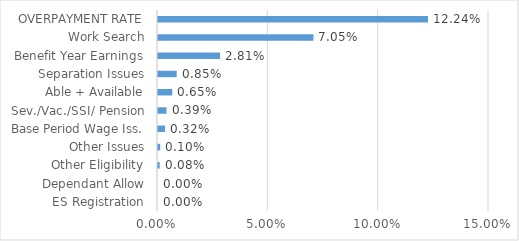
| Category | Series 0 |
|---|---|
| ES Registration | 0 |
| Dependant Allow | 0 |
| Other Eligibility | 0.001 |
| Other Issues | 0.001 |
| Base Period Wage Iss. | 0.003 |
| Sev./Vac./SSI/ Pension | 0.004 |
| Able + Available | 0.006 |
| Separation Issues | 0.008 |
| Benefit Year Earnings | 0.028 |
| Work Search | 0.07 |
| OVERPAYMENT RATE | 0.122 |